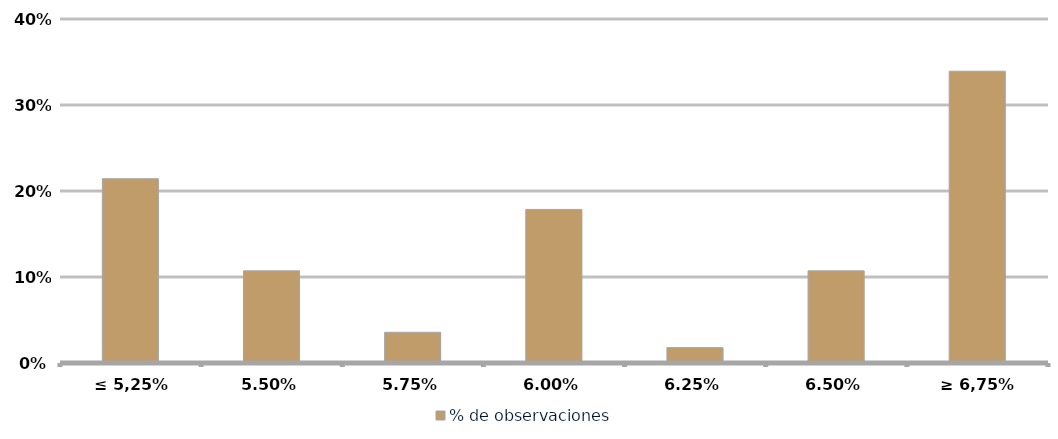
| Category | % de observaciones  |
|---|---|
| ≤ 5,25% | 0.214 |
| 5,50% | 0.107 |
| 5,75% | 0.036 |
| 6,00% | 0.179 |
| 6,25% | 0.018 |
| 6,50% | 0.107 |
| ≥ 6,75% | 0.339 |